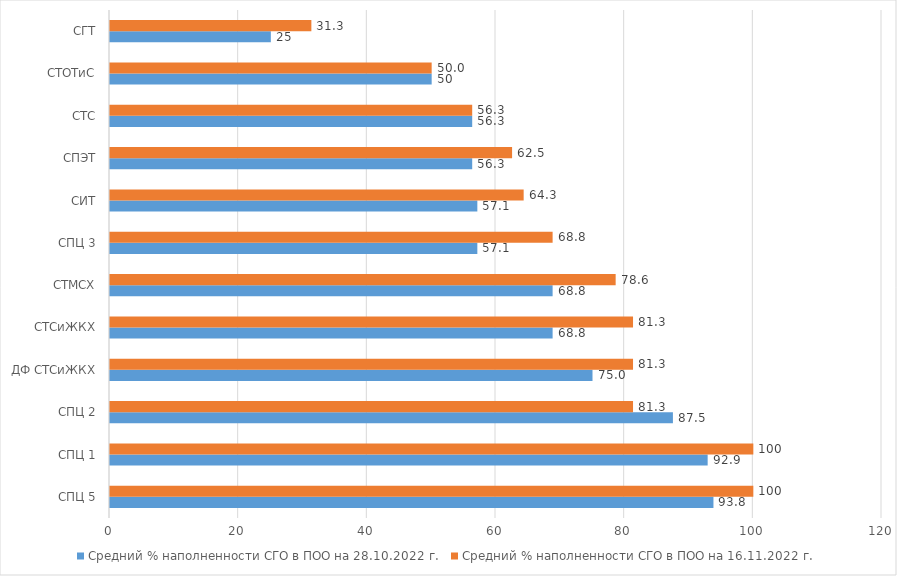
| Category | Средний % наполненности СГО в ПОО на 28.10.2022 г.  | Средний % наполненности СГО в ПОО на 16.11.2022 г.  |
|---|---|---|
| СПЦ 5 | 93.8 | 100 |
| СПЦ 1 | 92.9 | 100 |
| СПЦ 2 | 87.5 | 81.3 |
| ДФ СТСиЖКХ | 75 | 81.3 |
| СТСиЖКХ | 68.8 | 81.3 |
| СТМСХ | 68.8 | 78.6 |
| СПЦ 3 | 57.1 | 68.8 |
| СИТ | 57.1 | 64.3 |
| СПЭТ | 56.3 | 62.5 |
| СТС | 56.3 | 56.3 |
| СТОТиС | 50 | 50 |
| СГТ | 25 | 31.3 |